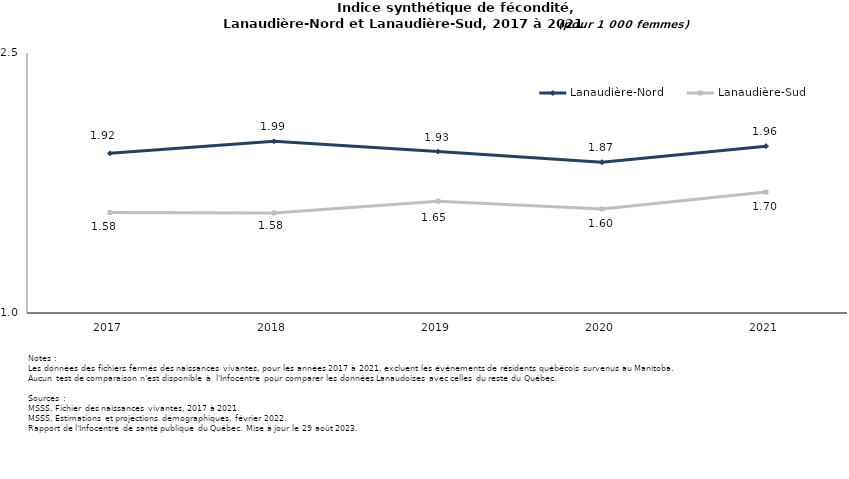
| Category | Lanaudière-Nord | Lanaudière-Sud |
|---|---|---|
| 2017.0 | 1.921 | 1.58 |
| 2018.0 | 1.991 | 1.577 |
| 2019.0 | 1.931 | 1.645 |
| 2020.0 | 1.87 | 1.6 |
| 2021.0 | 1.963 | 1.698 |